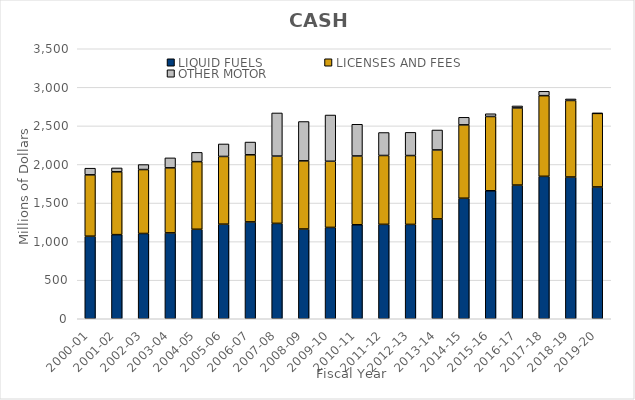
| Category | LIQUID FUELS | LICENSES AND FEES | OTHER MOTOR |
|---|---|---|---|
| 2000-01 | 1070.184 | 795.371 | 86.26 |
| 2001-02 | 1090.487 | 814.35 | 50.187 |
| 2002-03 | 1105.46 | 828.821 | 64.487 |
| 2003-04 | 1113.029 | 843.173 | 129.409 |
| 2004-05 | 1159.874 | 876.897 | 120.101 |
| 2005-06 | 1226.095 | 877.813 | 161.985 |
| 2006-07 | 1255.361 | 870.038 | 165.377 |
| 2007-08 | 1236.464 | 872.063 | 559.399 |
| 2008-09 | 1163.233 | 883.846 | 509.664 |
| 2009-10 | 1183.923 | 857.665 | 599.477 |
| 2010-11 | 1218.635 | 891.551 | 411.089 |
| 2011-12 | 1223.985 | 892.586 | 297.644 |
| 2012-13 | 1223.141 | 892.517 | 300.581 |
| 2013-14 | 1294.432 | 893.885 | 258.447 |
| 2014-15 | 1562.43 | 950.807 | 98.274 |
| 2015-16 | 1659.197 | 962.678 | 35.673 |
| 2016-17 | 1732.66 | 1000.529 | 25.341 |
| 2017-18 | 1846.403 | 1045.596 | 56.493 |
| 2018-19 | 1837.184 | 992.389 | 19.678 |
| 2019-20 | 1708.438 | 954.044 | 0.997 |